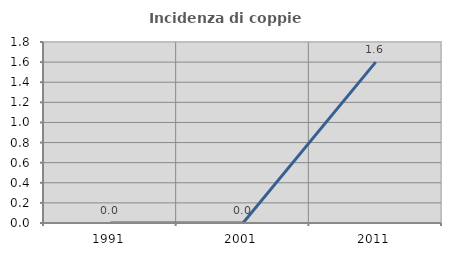
| Category | Incidenza di coppie miste |
|---|---|
| 1991.0 | 0 |
| 2001.0 | 0 |
| 2011.0 | 1.6 |